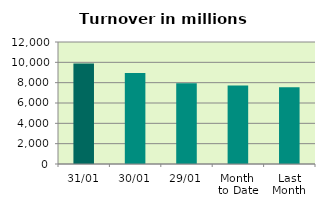
| Category | Series 0 |
|---|---|
| 31/01 | 9884.787 |
| 30/01 | 8945.674 |
| 29/01 | 7945.173 |
| Month 
to Date | 7723.751 |
| Last
Month | 7540.813 |